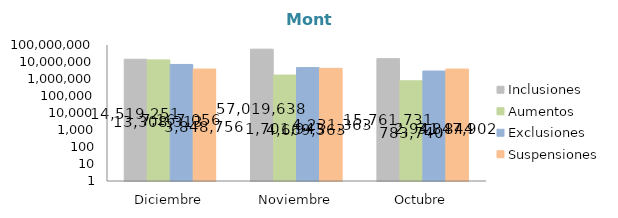
| Category | Inclusiones | Aumentos | Exclusiones | Suspensiones |
|---|---|---|---|---|
| Diciembre | 14519250.74 | 13308312.51 | 7167056.33 | 3848755.86 |
| Noviembre | 57019638.06 | 1701943.41 | 4669563.04 | 4231362.98 |
| Octubre | 15761730.61 | 783739.99 | 2941843.77 | 3847902.11 |